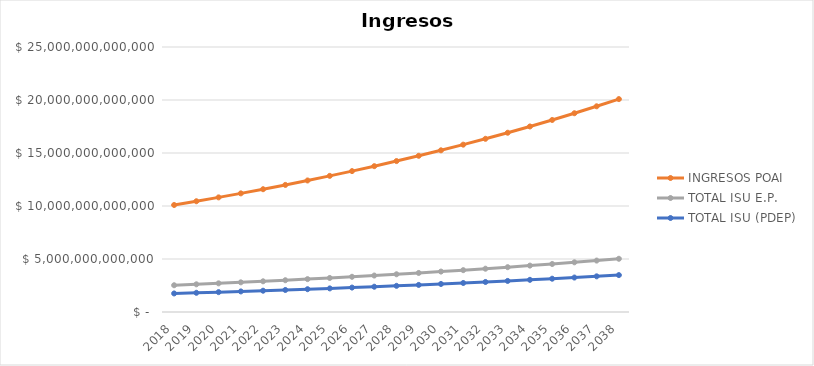
| Category | INGRESOS POAI | TOTAL ISU E.P. | TOTAL ISU (PDEP) |
|---|---|---|---|
| 2018.0 | 10094361014000 | 2523590253500 | 1749944232795.231 |
| 2019.0 | 10447663649490 | 2611915912372.5 | 1811192280943.064 |
| 2020.0 | 10813331877222.148 | 2703332969305.537 | 1874584010776.071 |
| 2021.0 | 11191798492924.922 | 2797949623231.23 | 1940194451153.233 |
| 2022.0 | 11583511440177.293 | 2895877860044.323 | 2008101256943.596 |
| 2023.0 | 11988934340583.498 | 2997233585145.874 | 2078384800936.622 |
| 2024.0 | 12408547042503.92 | 3102136760625.98 | 2151128268969.403 |
| 2025.0 | 12842846188991.557 | 3210711547247.889 | 2226417758383.332 |
| 2026.0 | 13292345805606.26 | 3323086451401.565 | 2304342379926.749 |
| 2027.0 | 13757577908802.479 | 3439394477200.62 | 2384994363224.185 |
| 2028.0 | 14239093135610.564 | 3559773283902.641 | 2468469165937.031 |
| 2029.0 | 14737461395356.934 | 3684365348839.234 | 2554865586744.827 |
| 2030.0 | 15253272544194.426 | 3813318136048.606 | 2644285882280.896 |
| 2031.0 | 15787137083241.229 | 3946784270810.307 | 2736835888160.727 |
| 2032.0 | 16339686881154.67 | 4084921720288.668 | 2832625144246.352 |
| 2033.0 | 16911575921995.082 | 4227893980498.77 | 2931767024294.974 |
| 2034.0 | 17503481079264.908 | 4375870269816.227 | 3034378870145.298 |
| 2035.0 | 18116102917039.18 | 4529025729259.795 | 3140582130600.384 |
| 2036.0 | 18750166519135.55 | 4687541629783.888 | 3250502505171.397 |
| 2037.0 | 19406422347305.293 | 4851605586826.323 | 3364270092852.396 |
| 2038.0 | 20085647129460.977 | 5021411782365.244 | 3482019546102.229 |